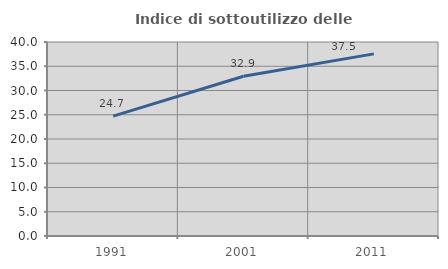
| Category | Indice di sottoutilizzo delle abitazioni  |
|---|---|
| 1991.0 | 24.712 |
| 2001.0 | 32.944 |
| 2011.0 | 37.547 |